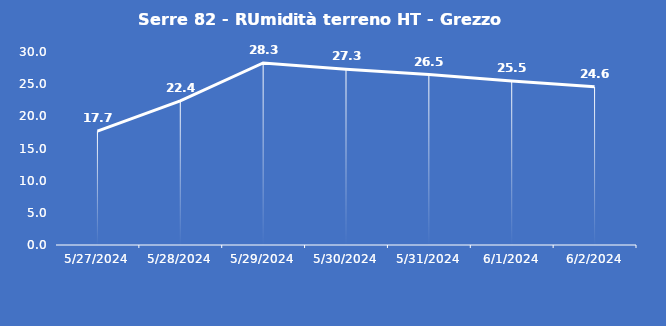
| Category | Serre 82 - RUmidità terreno HT - Grezzo (%VWC) |
|---|---|
| 5/27/24 | 17.7 |
| 5/28/24 | 22.4 |
| 5/29/24 | 28.3 |
| 5/30/24 | 27.3 |
| 5/31/24 | 26.5 |
| 6/1/24 | 25.5 |
| 6/2/24 | 24.6 |